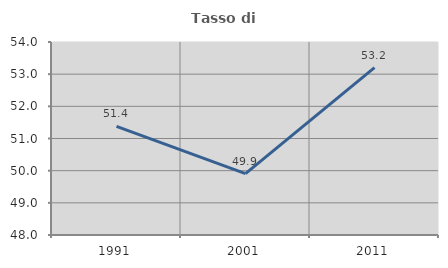
| Category | Tasso di occupazione   |
|---|---|
| 1991.0 | 51.378 |
| 2001.0 | 49.907 |
| 2011.0 | 53.204 |